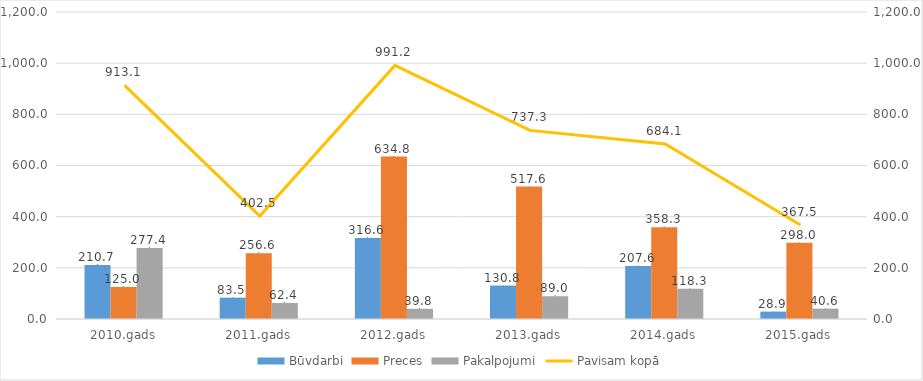
| Category | Būvdarbi | Preces | Pakalpojumi |
|---|---|---|---|
| 2010.gads | 210.7 | 125 | 277.4 |
| 2011.gads | 83.5 | 256.6 | 62.4 |
| 2012.gads | 316.6 | 634.8 | 39.8 |
| 2013.gads | 130.8 | 517.6 | 89 |
| 2014.gads | 207.6 | 358.3 | 118.3 |
| 2015.gads | 28.9 | 298 | 40.6 |